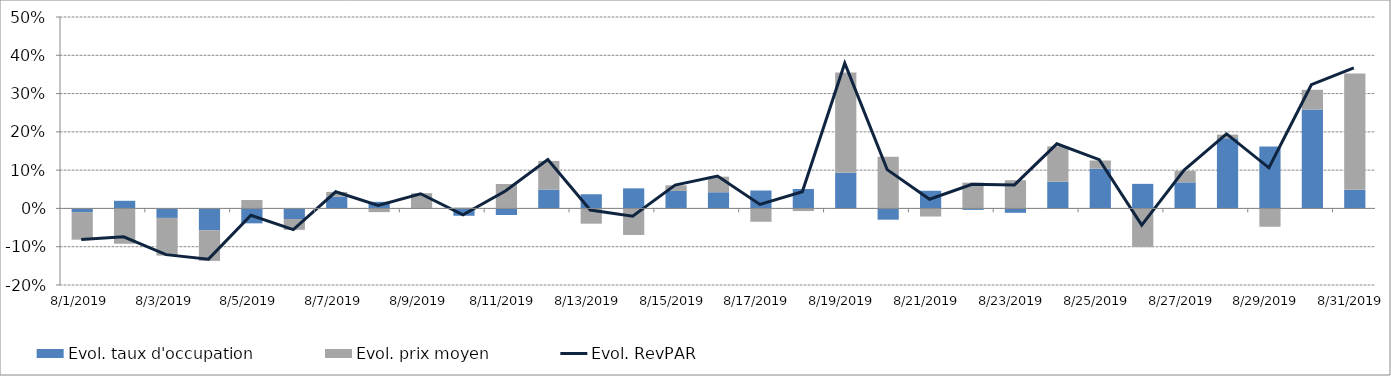
| Category | Evol. taux d'occupation | Evol. prix moyen |
|---|---|---|
| 8/1/19 | -0.009 | -0.072 |
| 8/2/19 | 0.02 | -0.092 |
| 8/3/19 | -0.025 | -0.098 |
| 8/4/19 | -0.057 | -0.08 |
| 8/5/19 | -0.039 | 0.022 |
| 8/6/19 | -0.028 | -0.028 |
| 8/7/19 | 0.031 | 0.012 |
| 8/8/19 | 0.017 | -0.01 |
| 8/9/19 | -0.001 | 0.04 |
| 8/10/19 | -0.019 | 0.002 |
| 8/11/19 | -0.017 | 0.064 |
| 8/12/19 | 0.049 | 0.075 |
| 8/13/19 | 0.037 | -0.04 |
| 8/14/19 | 0.052 | -0.069 |
| 8/15/19 | 0.046 | 0.015 |
| 8/16/19 | 0.042 | 0.041 |
| 8/17/19 | 0.047 | -0.035 |
| 8/18/19 | 0.051 | -0.007 |
| 8/19/19 | 0.093 | 0.262 |
| 8/20/19 | -0.029 | 0.135 |
| 8/21/19 | 0.046 | -0.021 |
| 8/22/19 | -0.004 | 0.067 |
| 8/23/19 | -0.011 | 0.074 |
| 8/24/19 | 0.07 | 0.092 |
| 8/25/19 | 0.104 | 0.021 |
| 8/26/19 | 0.064 | -0.101 |
| 8/27/19 | 0.068 | 0.03 |
| 8/28/19 | 0.183 | 0.01 |
| 8/29/19 | 0.162 | -0.048 |
| 8/30/19 | 0.259 | 0.051 |
| 8/31/19 | 0.049 | 0.304 |